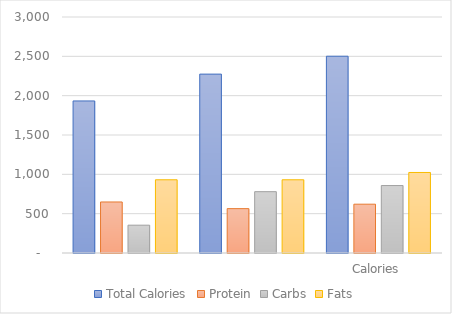
| Category | Total Calories | Protein | Carbs | Fats |
|---|---|---|---|---|
| 0 | 1932.9 | 648.6 | 353.7 | 930.6 |
| 1 | 2274 | 564 | 779.4 | 930.6 |
| 2 | 2501.4 | 620.4 | 857.34 | 1023.66 |